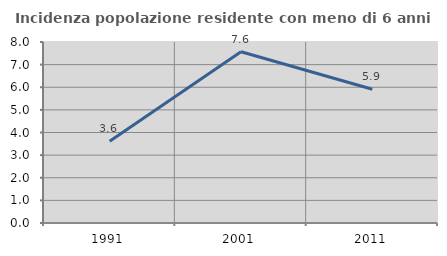
| Category | Incidenza popolazione residente con meno di 6 anni |
|---|---|
| 1991.0 | 3.611 |
| 2001.0 | 7.572 |
| 2011.0 | 5.914 |